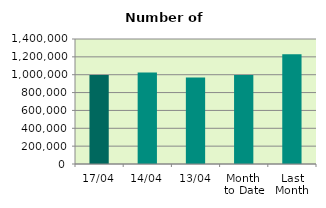
| Category | Series 0 |
|---|---|
| 17/04 | 995456 |
| 14/04 | 1024692 |
| 13/04 | 969752 |
| Month 
to Date | 997390.222 |
| Last
Month | 1228285.652 |